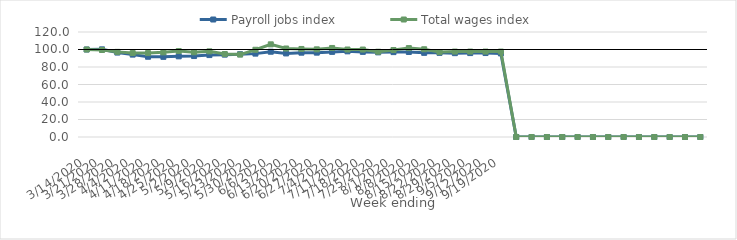
| Category | Payroll jobs index | Total wages index |
|---|---|---|
| 14/03/2020 | 100 | 100 |
| 21/03/2020 | 100.164 | 99.439 |
| 28/03/2020 | 96.485 | 97.287 |
| 04/04/2020 | 94.15 | 95.916 |
| 11/04/2020 | 91.708 | 95.9 |
| 18/04/2020 | 91.6 | 96.721 |
| 25/04/2020 | 92.188 | 98.185 |
| 02/05/2020 | 92.528 | 96.827 |
| 09/05/2020 | 93.616 | 97.887 |
| 16/05/2020 | 94.14 | 94.808 |
| 23/05/2020 | 94.621 | 94.206 |
| 30/05/2020 | 95.286 | 99.692 |
| 06/06/2020 | 97.451 | 105.899 |
| 13/06/2020 | 95.5 | 101.126 |
| 20/06/2020 | 96.368 | 100.613 |
| 27/06/2020 | 96.403 | 100.162 |
| 04/07/2020 | 97.28 | 101.756 |
| 11/07/2020 | 97.894 | 99.973 |
| 18/07/2020 | 97.277 | 99.938 |
| 25/07/2020 | 96.737 | 97.464 |
| 01/08/2020 | 97.014 | 99.384 |
| 08/08/2020 | 97.17 | 101.62 |
| 15/08/2020 | 96.174 | 100.262 |
| 22/08/2020 | 96.178 | 97.015 |
| 29/08/2020 | 95.812 | 97.616 |
| 05/09/2020 | 95.909 | 97.616 |
| 12/09/2020 | 95.954 | 97.617 |
| 19/09/2020 | 95.529 | 97.617 |